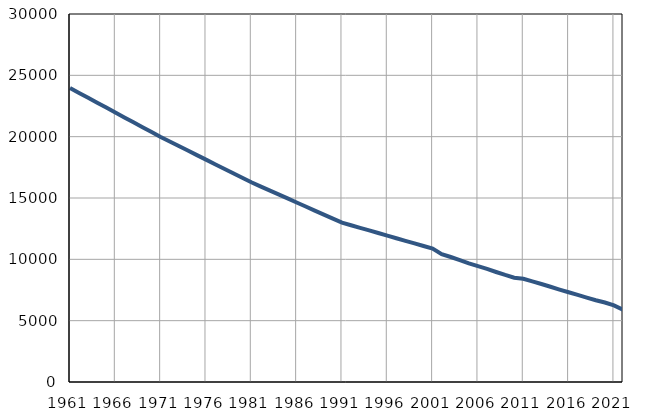
| Category | Број
становника |
|---|---|
| 1961.0 | 23965 |
| 1962.0 | 23566 |
| 1963.0 | 23167 |
| 1964.0 | 22768 |
| 1965.0 | 22369 |
| 1966.0 | 21970 |
| 1967.0 | 21570 |
| 1968.0 | 21171 |
| 1969.0 | 20772 |
| 1970.0 | 20373 |
| 1971.0 | 19974 |
| 1972.0 | 19605 |
| 1973.0 | 19235 |
| 1974.0 | 18866 |
| 1975.0 | 18497 |
| 1976.0 | 18127 |
| 1977.0 | 17758 |
| 1978.0 | 17389 |
| 1979.0 | 17020 |
| 1980.0 | 16650 |
| 1981.0 | 16281 |
| 1982.0 | 15952 |
| 1983.0 | 15623 |
| 1984.0 | 15294 |
| 1985.0 | 14965 |
| 1986.0 | 14636 |
| 1987.0 | 14306 |
| 1988.0 | 13977 |
| 1989.0 | 13648 |
| 1990.0 | 13319 |
| 1991.0 | 12990 |
| 1992.0 | 12778 |
| 1993.0 | 12566 |
| 1994.0 | 12355 |
| 1995.0 | 12143 |
| 1996.0 | 11931 |
| 1997.0 | 11719 |
| 1998.0 | 11507 |
| 1999.0 | 11295 |
| 2000.0 | 11084 |
| 2001.0 | 10872 |
| 2002.0 | 10414 |
| 2003.0 | 10189 |
| 2004.0 | 9938 |
| 2005.0 | 9676 |
| 2006.0 | 9445 |
| 2007.0 | 9216 |
| 2008.0 | 8967 |
| 2009.0 | 8726 |
| 2010.0 | 8505 |
| 2011.0 | 8415 |
| 2012.0 | 8202 |
| 2013.0 | 7990 |
| 2014.0 | 7767 |
| 2015.0 | 7535 |
| 2016.0 | 7317 |
| 2017.0 | 7098 |
| 2018.0 | 6879 |
| 2019.0 | 6664 |
| 2020.0 | 6480 |
| 2021.0 | 6240 |
| 2022.0 | 5889 |